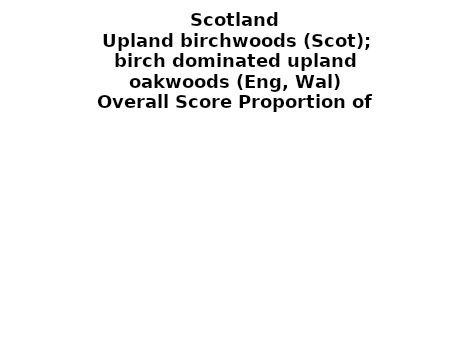
| Category | Upland birchwoods (Scot); birch dominated upland oakwoods (Eng, Wal) |
|---|---|
| 21 or less | 0 |
| 22 or 23 | 0 |
| 24 or 25 | 0.007 |
| 26 or 27 | 0.049 |
| 28 or 29 | 0.192 |
| 30 or 31 | 0.354 |
| 32 or 33 | 0.237 |
| 34 or 35 | 0.123 |
| 36 or 37 | 0.033 |
| 38 or 39 | 0.006 |
| 40 or 41 | 0 |
| 42 or 43 | 0 |
| 44 or more | 0 |